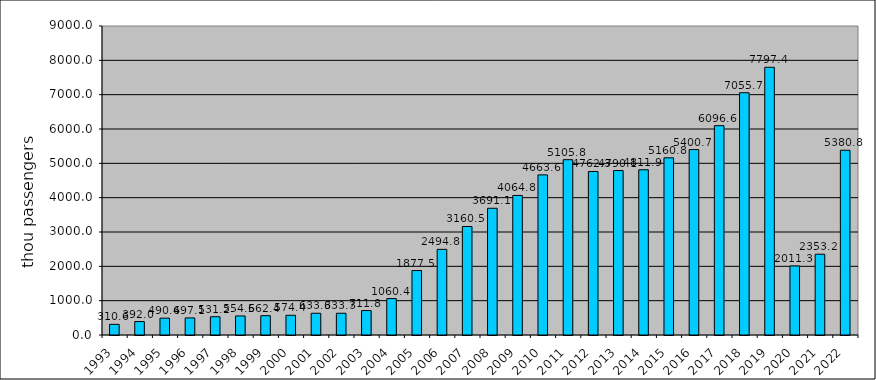
| Category | Series 0 |
|---|---|
| 1993.0 | 310.6 |
| 1994.0 | 392 |
| 1995.0 | 490.62 |
| 1996.0 | 497.13 |
| 1997.0 | 531.22 |
| 1998.0 | 554.62 |
| 1999.0 | 562.383 |
| 2000.0 | 574.356 |
| 2001.0 | 633.319 |
| 2002.0 | 633.319 |
| 2003.0 | 711.848 |
| 2004.0 | 1060.384 |
| 2005.0 | 1877.461 |
| 2006.0 | 2494.835 |
| 2007.0 | 3160.535 |
| 2008.0 | 3691.099 |
| 2009.0 | 4064.755 |
| 2010.0 | 4663.647 |
| 2011.0 | 5105.818 |
| 2012.0 | 4762.335 |
| 2013.0 | 4790.136 |
| 2014.0 | 4811.949 |
| 2015.0 | 5160.759 |
| 2016.0 | 5400.709 |
| 2017.0 | 6096.62 |
| 2018.0 | 7055.734 |
| 2019.0 | 7797.398 |
| 2020.0 | 2011.274 |
| 2021.0 | 2353.246 |
| 2022.0 | 5380.812 |